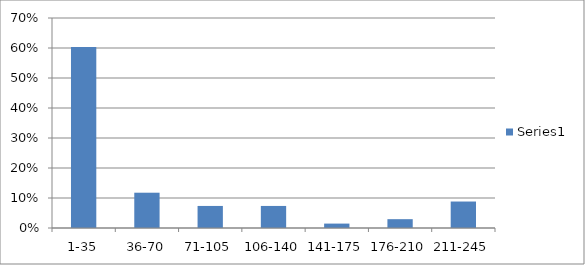
| Category | Series 0 |
|---|---|
| 1-35 | 0.603 |
| 36-70 | 0.118 |
| 71-105 | 0.074 |
| 106-140 | 0.074 |
| 141-175 | 0.015 |
| 176-210 | 0.029 |
| 211-245 | 0.088 |